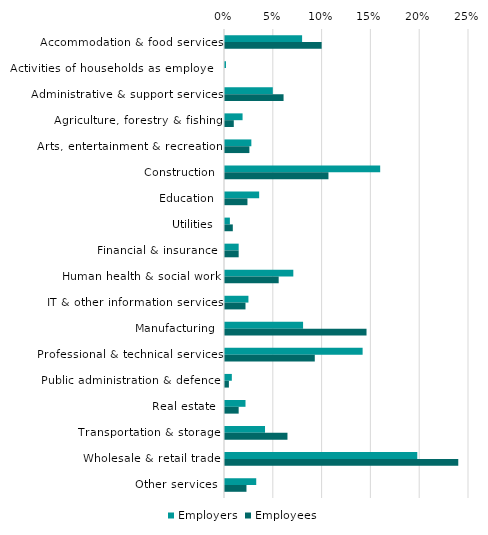
| Category | Employers | Employees |
|---|---|---|
| Accommodation & food services | 0.079 | 0.099 |
| Activities of households as employers | 0.001 | 0 |
| Administrative & support services | 0.049 | 0.06 |
| Agriculture, forestry & fishing | 0.018 | 0.009 |
| Arts, entertainment & recreation | 0.027 | 0.025 |
| Construction | 0.159 | 0.106 |
| Education | 0.035 | 0.023 |
| Utilities | 0.005 | 0.008 |
| Financial & insurance | 0.014 | 0.014 |
| Human health & social work | 0.07 | 0.055 |
| IT & other information services | 0.024 | 0.021 |
| Manufacturing | 0.08 | 0.145 |
| Professional & technical services | 0.141 | 0.092 |
| Public administration & defence | 0.007 | 0.004 |
| Real estate | 0.021 | 0.014 |
| Transportation & storage | 0.041 | 0.064 |
| Wholesale & retail trade | 0.197 | 0.239 |
| Other services | 0.032 | 0.022 |